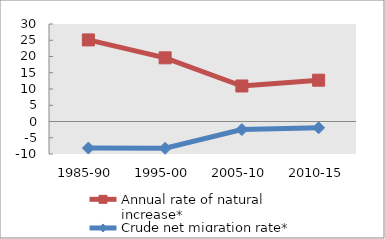
| Category | Annual rate of natural increase* | Crude net migration rate* |
|---|---|---|
| 1985-90 | 25.101 | -8.179 |
| 1995-00 | 19.593 | -8.247 |
| 2005-10 | 10.928 | -2.482 |
| 2010-15 | 12.709 | -1.937 |